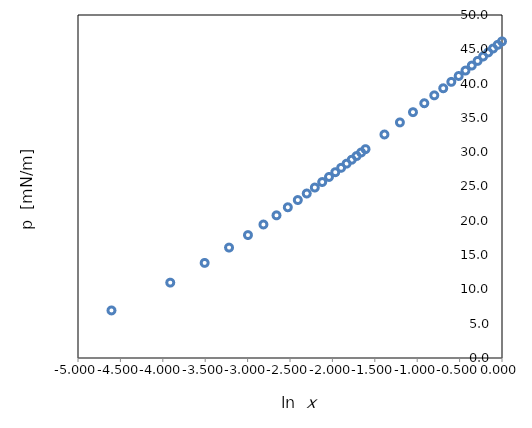
| Category | Presión superficial - composición |
|---|---|
| -4.605170185988091 | 6.931 |
| -3.912023005428146 | 10.986 |
| -3.506557897319982 | 13.863 |
| -3.2188758248682006 | 16.094 |
| -2.995732273553991 | 17.918 |
| -2.8134107167600364 | 19.459 |
| -2.659260036932778 | 20.794 |
| -2.5257286443082556 | 21.972 |
| -2.4079456086518722 | 23.026 |
| -2.302585092994046 | 23.979 |
| -2.207274913189721 | 24.849 |
| -2.120263536200091 | 25.649 |
| -2.0402208285265546 | 26.391 |
| -1.966112856372833 | 27.081 |
| -1.8971199848858813 | 27.726 |
| -1.8325814637483102 | 28.332 |
| -1.7719568419318752 | 28.904 |
| -1.7147984280919266 | 29.444 |
| -1.6607312068216507 | 29.957 |
| -1.6094379124341003 | 30.445 |
| -1.3862943611198904 | 32.581 |
| -1.203972804325936 | 34.34 |
| -1.0498221244986776 | 35.835 |
| -0.916290731874155 | 37.136 |
| -0.7985076962177716 | 38.286 |
| -0.6931471805599453 | 39.318 |
| -0.5978370007556204 | 40.254 |
| -0.5108256237659905 | 41.109 |
| -0.43078291609245406 | 41.897 |
| -0.3566749439387321 | 42.627 |
| -0.2876820724517806 | 43.307 |
| -0.22314355131420943 | 43.944 |
| -0.16251892949777455 | 44.543 |
| -0.1053605156578259 | 45.109 |
| -0.05129329438755011 | 45.643 |
| 4.440892098500625e-16 | 46.151 |